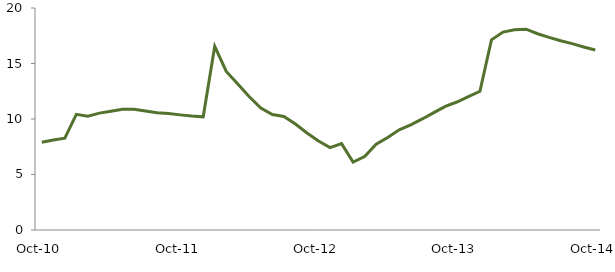
| Category | Series 0 |
|---|---|
| Oct-10 | 7.91 |
|  | 8.116 |
|  | 8.269 |
|  | 10.421 |
|  | 10.256 |
|  | 10.532 |
|  | 10.695 |
|  | 10.88 |
|  | 10.867 |
|  | 10.717 |
|  | 10.566 |
|  | 10.492 |
| Oct-11 | 10.372 |
|  | 10.261 |
|  | 10.197 |
|  | 16.554 |
|  | 14.287 |
|  | 13.149 |
|  | 12.01 |
|  | 10.979 |
|  | 10.402 |
|  | 10.221 |
|  | 9.554 |
|  | 8.736 |
| Oct-12 | 8.023 |
|  | 7.421 |
|  | 7.783 |
|  | 6.12 |
|  | 6.613 |
|  | 7.721 |
|  | 8.337 |
|  | 9.021 |
|  | 9.471 |
|  | 10.005 |
|  | 10.58 |
|  | 11.134 |
| Oct-13 | 11.529 |
|  | 12.009 |
|  | 12.5 |
|  | 17.13 |
|  | 17.828 |
|  | 18.046 |
|  | 18.095 |
|  | 17.683 |
|  | 17.351 |
|  | 17.046 |
|  | 16.788 |
|  | 16.483 |
| Oct-14 | 16.215 |